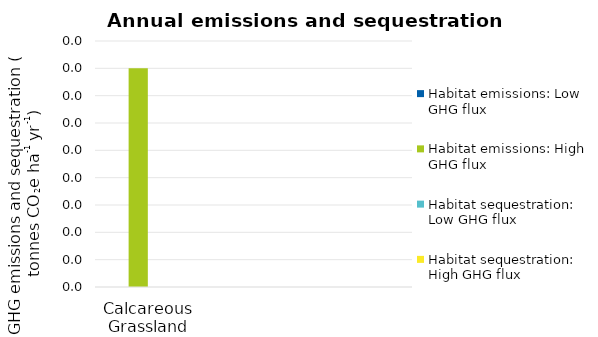
| Category | Habitat emissions: | Habitat sequestration: |
|---|---|---|
| Calcareous Grassland | 0.04 | 0 |
|   | 0 | 0 |
|   | 0 | 0 |